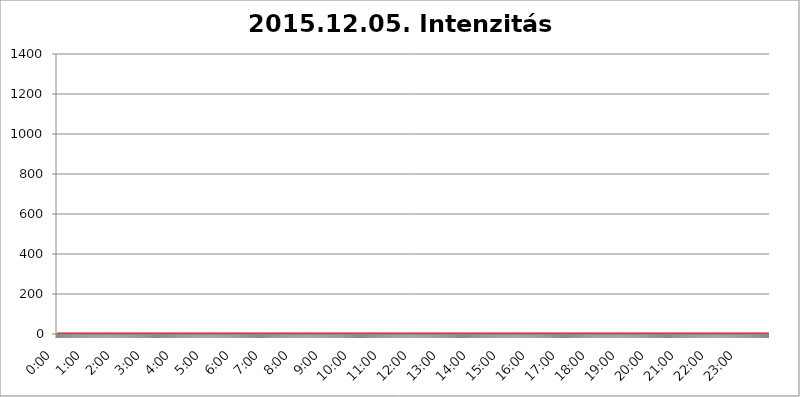
| Category | 2015.12.05. Intenzitás [W/m^2] |
|---|---|
| 0.0 | 0 |
| 0.0006944444444444445 | 0 |
| 0.001388888888888889 | 0 |
| 0.0020833333333333333 | 0 |
| 0.002777777777777778 | 0 |
| 0.003472222222222222 | 0 |
| 0.004166666666666667 | 0 |
| 0.004861111111111111 | 0 |
| 0.005555555555555556 | 0 |
| 0.0062499999999999995 | 0 |
| 0.006944444444444444 | 0 |
| 0.007638888888888889 | 0 |
| 0.008333333333333333 | 0 |
| 0.009027777777777779 | 0 |
| 0.009722222222222222 | 0 |
| 0.010416666666666666 | 0 |
| 0.011111111111111112 | 0 |
| 0.011805555555555555 | 0 |
| 0.012499999999999999 | 0 |
| 0.013194444444444444 | 0 |
| 0.013888888888888888 | 0 |
| 0.014583333333333332 | 0 |
| 0.015277777777777777 | 0 |
| 0.015972222222222224 | 0 |
| 0.016666666666666666 | 0 |
| 0.017361111111111112 | 0 |
| 0.018055555555555557 | 0 |
| 0.01875 | 0 |
| 0.019444444444444445 | 0 |
| 0.02013888888888889 | 0 |
| 0.020833333333333332 | 0 |
| 0.02152777777777778 | 0 |
| 0.022222222222222223 | 0 |
| 0.02291666666666667 | 0 |
| 0.02361111111111111 | 0 |
| 0.024305555555555556 | 0 |
| 0.024999999999999998 | 0 |
| 0.025694444444444447 | 0 |
| 0.02638888888888889 | 0 |
| 0.027083333333333334 | 0 |
| 0.027777777777777776 | 0 |
| 0.02847222222222222 | 0 |
| 0.029166666666666664 | 0 |
| 0.029861111111111113 | 0 |
| 0.030555555555555555 | 0 |
| 0.03125 | 0 |
| 0.03194444444444445 | 0 |
| 0.03263888888888889 | 0 |
| 0.03333333333333333 | 0 |
| 0.034027777777777775 | 0 |
| 0.034722222222222224 | 0 |
| 0.035416666666666666 | 0 |
| 0.036111111111111115 | 0 |
| 0.03680555555555556 | 0 |
| 0.0375 | 0 |
| 0.03819444444444444 | 0 |
| 0.03888888888888889 | 0 |
| 0.03958333333333333 | 0 |
| 0.04027777777777778 | 0 |
| 0.04097222222222222 | 0 |
| 0.041666666666666664 | 0 |
| 0.042361111111111106 | 0 |
| 0.04305555555555556 | 0 |
| 0.043750000000000004 | 0 |
| 0.044444444444444446 | 0 |
| 0.04513888888888889 | 0 |
| 0.04583333333333334 | 0 |
| 0.04652777777777778 | 0 |
| 0.04722222222222222 | 0 |
| 0.04791666666666666 | 0 |
| 0.04861111111111111 | 0 |
| 0.049305555555555554 | 0 |
| 0.049999999999999996 | 0 |
| 0.05069444444444445 | 0 |
| 0.051388888888888894 | 0 |
| 0.052083333333333336 | 0 |
| 0.05277777777777778 | 0 |
| 0.05347222222222222 | 0 |
| 0.05416666666666667 | 0 |
| 0.05486111111111111 | 0 |
| 0.05555555555555555 | 0 |
| 0.05625 | 0 |
| 0.05694444444444444 | 0 |
| 0.057638888888888885 | 0 |
| 0.05833333333333333 | 0 |
| 0.05902777777777778 | 0 |
| 0.059722222222222225 | 0 |
| 0.06041666666666667 | 0 |
| 0.061111111111111116 | 0 |
| 0.06180555555555556 | 0 |
| 0.0625 | 0 |
| 0.06319444444444444 | 0 |
| 0.06388888888888888 | 0 |
| 0.06458333333333334 | 0 |
| 0.06527777777777778 | 0 |
| 0.06597222222222222 | 0 |
| 0.06666666666666667 | 0 |
| 0.06736111111111111 | 0 |
| 0.06805555555555555 | 0 |
| 0.06874999999999999 | 0 |
| 0.06944444444444443 | 0 |
| 0.07013888888888889 | 0 |
| 0.07083333333333333 | 0 |
| 0.07152777777777779 | 0 |
| 0.07222222222222223 | 0 |
| 0.07291666666666667 | 0 |
| 0.07361111111111111 | 0 |
| 0.07430555555555556 | 0 |
| 0.075 | 0 |
| 0.07569444444444444 | 0 |
| 0.0763888888888889 | 0 |
| 0.07708333333333334 | 0 |
| 0.07777777777777778 | 0 |
| 0.07847222222222222 | 0 |
| 0.07916666666666666 | 0 |
| 0.0798611111111111 | 0 |
| 0.08055555555555556 | 0 |
| 0.08125 | 0 |
| 0.08194444444444444 | 0 |
| 0.08263888888888889 | 0 |
| 0.08333333333333333 | 0 |
| 0.08402777777777777 | 0 |
| 0.08472222222222221 | 0 |
| 0.08541666666666665 | 0 |
| 0.08611111111111112 | 0 |
| 0.08680555555555557 | 0 |
| 0.08750000000000001 | 0 |
| 0.08819444444444445 | 0 |
| 0.08888888888888889 | 0 |
| 0.08958333333333333 | 0 |
| 0.09027777777777778 | 0 |
| 0.09097222222222222 | 0 |
| 0.09166666666666667 | 0 |
| 0.09236111111111112 | 0 |
| 0.09305555555555556 | 0 |
| 0.09375 | 0 |
| 0.09444444444444444 | 0 |
| 0.09513888888888888 | 0 |
| 0.09583333333333333 | 0 |
| 0.09652777777777777 | 0 |
| 0.09722222222222222 | 0 |
| 0.09791666666666667 | 0 |
| 0.09861111111111111 | 0 |
| 0.09930555555555555 | 0 |
| 0.09999999999999999 | 0 |
| 0.10069444444444443 | 0 |
| 0.1013888888888889 | 0 |
| 0.10208333333333335 | 0 |
| 0.10277777777777779 | 0 |
| 0.10347222222222223 | 0 |
| 0.10416666666666667 | 0 |
| 0.10486111111111111 | 0 |
| 0.10555555555555556 | 0 |
| 0.10625 | 0 |
| 0.10694444444444444 | 0 |
| 0.1076388888888889 | 0 |
| 0.10833333333333334 | 0 |
| 0.10902777777777778 | 0 |
| 0.10972222222222222 | 0 |
| 0.1111111111111111 | 0 |
| 0.11180555555555556 | 0 |
| 0.11180555555555556 | 0 |
| 0.1125 | 0 |
| 0.11319444444444444 | 0 |
| 0.11388888888888889 | 0 |
| 0.11458333333333333 | 0 |
| 0.11527777777777777 | 0 |
| 0.11597222222222221 | 0 |
| 0.11666666666666665 | 0 |
| 0.1173611111111111 | 0 |
| 0.11805555555555557 | 0 |
| 0.11944444444444445 | 0 |
| 0.12013888888888889 | 0 |
| 0.12083333333333333 | 0 |
| 0.12152777777777778 | 0 |
| 0.12222222222222223 | 0 |
| 0.12291666666666667 | 0 |
| 0.12291666666666667 | 0 |
| 0.12361111111111112 | 0 |
| 0.12430555555555556 | 0 |
| 0.125 | 0 |
| 0.12569444444444444 | 0 |
| 0.12638888888888888 | 0 |
| 0.12708333333333333 | 0 |
| 0.16875 | 0 |
| 0.12847222222222224 | 0 |
| 0.12916666666666668 | 0 |
| 0.12986111111111112 | 0 |
| 0.13055555555555556 | 0 |
| 0.13125 | 0 |
| 0.13194444444444445 | 0 |
| 0.1326388888888889 | 0 |
| 0.13333333333333333 | 0 |
| 0.13402777777777777 | 0 |
| 0.13402777777777777 | 0 |
| 0.13472222222222222 | 0 |
| 0.13541666666666666 | 0 |
| 0.1361111111111111 | 0 |
| 0.13749999999999998 | 0 |
| 0.13819444444444443 | 0 |
| 0.1388888888888889 | 0 |
| 0.13958333333333334 | 0 |
| 0.14027777777777778 | 0 |
| 0.14097222222222222 | 0 |
| 0.14166666666666666 | 0 |
| 0.1423611111111111 | 0 |
| 0.14305555555555557 | 0 |
| 0.14375000000000002 | 0 |
| 0.14444444444444446 | 0 |
| 0.1451388888888889 | 0 |
| 0.1451388888888889 | 0 |
| 0.14652777777777778 | 0 |
| 0.14722222222222223 | 0 |
| 0.14791666666666667 | 0 |
| 0.1486111111111111 | 0 |
| 0.14930555555555555 | 0 |
| 0.15 | 0 |
| 0.15069444444444444 | 0 |
| 0.15138888888888888 | 0 |
| 0.15208333333333332 | 0 |
| 0.15277777777777776 | 0 |
| 0.15347222222222223 | 0 |
| 0.15416666666666667 | 0 |
| 0.15486111111111112 | 0 |
| 0.15555555555555556 | 0 |
| 0.15625 | 0 |
| 0.15694444444444444 | 0 |
| 0.15763888888888888 | 0 |
| 0.15833333333333333 | 0 |
| 0.15902777777777777 | 0 |
| 0.15972222222222224 | 0 |
| 0.16041666666666668 | 0 |
| 0.16111111111111112 | 0 |
| 0.16180555555555556 | 0 |
| 0.1625 | 0 |
| 0.16319444444444445 | 0 |
| 0.1638888888888889 | 0 |
| 0.16458333333333333 | 0 |
| 0.16527777777777777 | 0 |
| 0.16597222222222222 | 0 |
| 0.16666666666666666 | 0 |
| 0.1673611111111111 | 0 |
| 0.16805555555555554 | 0 |
| 0.16874999999999998 | 0 |
| 0.16944444444444443 | 0 |
| 0.17013888888888887 | 0 |
| 0.1708333333333333 | 0 |
| 0.17152777777777775 | 0 |
| 0.17222222222222225 | 0 |
| 0.1729166666666667 | 0 |
| 0.17361111111111113 | 0 |
| 0.17430555555555557 | 0 |
| 0.17500000000000002 | 0 |
| 0.17569444444444446 | 0 |
| 0.1763888888888889 | 0 |
| 0.17708333333333334 | 0 |
| 0.17777777777777778 | 0 |
| 0.17847222222222223 | 0 |
| 0.17916666666666667 | 0 |
| 0.1798611111111111 | 0 |
| 0.18055555555555555 | 0 |
| 0.18125 | 0 |
| 0.18194444444444444 | 0 |
| 0.1826388888888889 | 0 |
| 0.18333333333333335 | 0 |
| 0.1840277777777778 | 0 |
| 0.18472222222222223 | 0 |
| 0.18541666666666667 | 0 |
| 0.18611111111111112 | 0 |
| 0.18680555555555556 | 0 |
| 0.1875 | 0 |
| 0.18819444444444444 | 0 |
| 0.18888888888888888 | 0 |
| 0.18958333333333333 | 0 |
| 0.19027777777777777 | 0 |
| 0.1909722222222222 | 0 |
| 0.19166666666666665 | 0 |
| 0.19236111111111112 | 0 |
| 0.19305555555555554 | 0 |
| 0.19375 | 0 |
| 0.19444444444444445 | 0 |
| 0.1951388888888889 | 0 |
| 0.19583333333333333 | 0 |
| 0.19652777777777777 | 0 |
| 0.19722222222222222 | 0 |
| 0.19791666666666666 | 0 |
| 0.1986111111111111 | 0 |
| 0.19930555555555554 | 0 |
| 0.19999999999999998 | 0 |
| 0.20069444444444443 | 0 |
| 0.20138888888888887 | 0 |
| 0.2020833333333333 | 0 |
| 0.2027777777777778 | 0 |
| 0.2034722222222222 | 0 |
| 0.2041666666666667 | 0 |
| 0.20486111111111113 | 0 |
| 0.20555555555555557 | 0 |
| 0.20625000000000002 | 0 |
| 0.20694444444444446 | 0 |
| 0.2076388888888889 | 0 |
| 0.20833333333333334 | 0 |
| 0.20902777777777778 | 0 |
| 0.20972222222222223 | 0 |
| 0.21041666666666667 | 0 |
| 0.2111111111111111 | 0 |
| 0.21180555555555555 | 0 |
| 0.2125 | 0 |
| 0.21319444444444444 | 0 |
| 0.2138888888888889 | 0 |
| 0.21458333333333335 | 0 |
| 0.2152777777777778 | 0 |
| 0.21597222222222223 | 0 |
| 0.21666666666666667 | 0 |
| 0.21736111111111112 | 0 |
| 0.21805555555555556 | 0 |
| 0.21875 | 0 |
| 0.21944444444444444 | 0 |
| 0.22013888888888888 | 0 |
| 0.22083333333333333 | 0 |
| 0.22152777777777777 | 0 |
| 0.2222222222222222 | 0 |
| 0.22291666666666665 | 0 |
| 0.2236111111111111 | 0 |
| 0.22430555555555556 | 0 |
| 0.225 | 0 |
| 0.22569444444444445 | 0 |
| 0.2263888888888889 | 0 |
| 0.22708333333333333 | 0 |
| 0.22777777777777777 | 0 |
| 0.22847222222222222 | 0 |
| 0.22916666666666666 | 0 |
| 0.2298611111111111 | 0 |
| 0.23055555555555554 | 0 |
| 0.23124999999999998 | 0 |
| 0.23194444444444443 | 0 |
| 0.23263888888888887 | 0 |
| 0.2333333333333333 | 0 |
| 0.2340277777777778 | 0 |
| 0.2347222222222222 | 0 |
| 0.2354166666666667 | 0 |
| 0.23611111111111113 | 0 |
| 0.23680555555555557 | 0 |
| 0.23750000000000002 | 0 |
| 0.23819444444444446 | 0 |
| 0.2388888888888889 | 0 |
| 0.23958333333333334 | 0 |
| 0.24027777777777778 | 0 |
| 0.24097222222222223 | 0 |
| 0.24166666666666667 | 0 |
| 0.2423611111111111 | 0 |
| 0.24305555555555555 | 0 |
| 0.24375 | 0 |
| 0.24444444444444446 | 0 |
| 0.24513888888888888 | 0 |
| 0.24583333333333335 | 0 |
| 0.2465277777777778 | 0 |
| 0.24722222222222223 | 0 |
| 0.24791666666666667 | 0 |
| 0.24861111111111112 | 0 |
| 0.24930555555555556 | 0 |
| 0.25 | 0 |
| 0.25069444444444444 | 0 |
| 0.2513888888888889 | 0 |
| 0.2520833333333333 | 0 |
| 0.25277777777777777 | 0 |
| 0.2534722222222222 | 0 |
| 0.25416666666666665 | 0 |
| 0.2548611111111111 | 0 |
| 0.2555555555555556 | 0 |
| 0.25625000000000003 | 0 |
| 0.2569444444444445 | 0 |
| 0.2576388888888889 | 0 |
| 0.25833333333333336 | 0 |
| 0.2590277777777778 | 0 |
| 0.25972222222222224 | 0 |
| 0.2604166666666667 | 0 |
| 0.2611111111111111 | 0 |
| 0.26180555555555557 | 0 |
| 0.2625 | 0 |
| 0.26319444444444445 | 0 |
| 0.2638888888888889 | 0 |
| 0.26458333333333334 | 0 |
| 0.2652777777777778 | 0 |
| 0.2659722222222222 | 0 |
| 0.26666666666666666 | 0 |
| 0.2673611111111111 | 0 |
| 0.26805555555555555 | 0 |
| 0.26875 | 0 |
| 0.26944444444444443 | 0 |
| 0.2701388888888889 | 0 |
| 0.2708333333333333 | 0 |
| 0.27152777777777776 | 0 |
| 0.2722222222222222 | 0 |
| 0.27291666666666664 | 0 |
| 0.2736111111111111 | 0 |
| 0.2743055555555555 | 0 |
| 0.27499999999999997 | 0 |
| 0.27569444444444446 | 0 |
| 0.27638888888888885 | 0 |
| 0.27708333333333335 | 0 |
| 0.2777777777777778 | 0 |
| 0.27847222222222223 | 0 |
| 0.2791666666666667 | 0 |
| 0.2798611111111111 | 0 |
| 0.28055555555555556 | 0 |
| 0.28125 | 0 |
| 0.28194444444444444 | 0 |
| 0.2826388888888889 | 0 |
| 0.2833333333333333 | 0 |
| 0.28402777777777777 | 0 |
| 0.2847222222222222 | 0 |
| 0.28541666666666665 | 0 |
| 0.28611111111111115 | 0 |
| 0.28680555555555554 | 0 |
| 0.28750000000000003 | 0 |
| 0.2881944444444445 | 0 |
| 0.2888888888888889 | 0 |
| 0.28958333333333336 | 0 |
| 0.2902777777777778 | 0 |
| 0.29097222222222224 | 0 |
| 0.2916666666666667 | 0 |
| 0.2923611111111111 | 0 |
| 0.29305555555555557 | 0 |
| 0.29375 | 0 |
| 0.29444444444444445 | 0 |
| 0.2951388888888889 | 0 |
| 0.29583333333333334 | 0 |
| 0.2965277777777778 | 0 |
| 0.2972222222222222 | 0 |
| 0.29791666666666666 | 0 |
| 0.2986111111111111 | 0 |
| 0.29930555555555555 | 0 |
| 0.3 | 0 |
| 0.30069444444444443 | 0 |
| 0.3013888888888889 | 0 |
| 0.3020833333333333 | 0 |
| 0.30277777777777776 | 0 |
| 0.3034722222222222 | 0 |
| 0.30416666666666664 | 0 |
| 0.3048611111111111 | 0 |
| 0.3055555555555555 | 0 |
| 0.30624999999999997 | 0 |
| 0.3069444444444444 | 0 |
| 0.3076388888888889 | 0 |
| 0.30833333333333335 | 0 |
| 0.3090277777777778 | 0 |
| 0.30972222222222223 | 0 |
| 0.3104166666666667 | 0 |
| 0.3111111111111111 | 0 |
| 0.31180555555555556 | 0 |
| 0.3125 | 0 |
| 0.31319444444444444 | 0 |
| 0.3138888888888889 | 0 |
| 0.3145833333333333 | 0 |
| 0.31527777777777777 | 0 |
| 0.3159722222222222 | 0 |
| 0.31666666666666665 | 0 |
| 0.31736111111111115 | 0 |
| 0.31805555555555554 | 0 |
| 0.31875000000000003 | 0 |
| 0.3194444444444445 | 0 |
| 0.3201388888888889 | 0 |
| 0.32083333333333336 | 0 |
| 0.3215277777777778 | 0 |
| 0.32222222222222224 | 0 |
| 0.3229166666666667 | 0 |
| 0.3236111111111111 | 0 |
| 0.32430555555555557 | 0 |
| 0.325 | 0 |
| 0.32569444444444445 | 0 |
| 0.3263888888888889 | 0 |
| 0.32708333333333334 | 0 |
| 0.3277777777777778 | 0 |
| 0.3284722222222222 | 0 |
| 0.32916666666666666 | 0 |
| 0.3298611111111111 | 0 |
| 0.33055555555555555 | 0 |
| 0.33125 | 0 |
| 0.33194444444444443 | 0 |
| 0.3326388888888889 | 0 |
| 0.3333333333333333 | 0 |
| 0.3340277777777778 | 0 |
| 0.3347222222222222 | 0 |
| 0.3354166666666667 | 0 |
| 0.3361111111111111 | 0 |
| 0.3368055555555556 | 0 |
| 0.33749999999999997 | 0 |
| 0.33819444444444446 | 0 |
| 0.33888888888888885 | 0 |
| 0.33958333333333335 | 0 |
| 0.34027777777777773 | 0 |
| 0.34097222222222223 | 0 |
| 0.3416666666666666 | 0 |
| 0.3423611111111111 | 0 |
| 0.3430555555555555 | 0 |
| 0.34375 | 0 |
| 0.3444444444444445 | 0 |
| 0.3451388888888889 | 0 |
| 0.3458333333333334 | 0 |
| 0.34652777777777777 | 0 |
| 0.34722222222222227 | 0 |
| 0.34791666666666665 | 0 |
| 0.34861111111111115 | 0 |
| 0.34930555555555554 | 0 |
| 0.35000000000000003 | 0 |
| 0.3506944444444444 | 0 |
| 0.3513888888888889 | 0 |
| 0.3520833333333333 | 0 |
| 0.3527777777777778 | 0 |
| 0.3534722222222222 | 0 |
| 0.3541666666666667 | 0 |
| 0.3548611111111111 | 0 |
| 0.35555555555555557 | 0 |
| 0.35625 | 0 |
| 0.35694444444444445 | 0 |
| 0.3576388888888889 | 0 |
| 0.35833333333333334 | 0 |
| 0.3590277777777778 | 0 |
| 0.3597222222222222 | 0 |
| 0.36041666666666666 | 0 |
| 0.3611111111111111 | 0 |
| 0.36180555555555555 | 0 |
| 0.3625 | 0 |
| 0.36319444444444443 | 0 |
| 0.3638888888888889 | 0 |
| 0.3645833333333333 | 0 |
| 0.3652777777777778 | 0 |
| 0.3659722222222222 | 0 |
| 0.3666666666666667 | 0 |
| 0.3673611111111111 | 0 |
| 0.3680555555555556 | 0 |
| 0.36874999999999997 | 0 |
| 0.36944444444444446 | 0 |
| 0.37013888888888885 | 0 |
| 0.37083333333333335 | 0 |
| 0.37152777777777773 | 0 |
| 0.37222222222222223 | 0 |
| 0.3729166666666666 | 0 |
| 0.3736111111111111 | 0 |
| 0.3743055555555555 | 0 |
| 0.375 | 0 |
| 0.3756944444444445 | 0 |
| 0.3763888888888889 | 0 |
| 0.3770833333333334 | 0 |
| 0.37777777777777777 | 0 |
| 0.37847222222222227 | 0 |
| 0.37916666666666665 | 0 |
| 0.37986111111111115 | 0 |
| 0.38055555555555554 | 0 |
| 0.38125000000000003 | 0 |
| 0.3819444444444444 | 0 |
| 0.3826388888888889 | 0 |
| 0.3833333333333333 | 0 |
| 0.3840277777777778 | 0 |
| 0.3847222222222222 | 0 |
| 0.3854166666666667 | 0 |
| 0.3861111111111111 | 0 |
| 0.38680555555555557 | 0 |
| 0.3875 | 0 |
| 0.38819444444444445 | 0 |
| 0.3888888888888889 | 0 |
| 0.38958333333333334 | 0 |
| 0.3902777777777778 | 0 |
| 0.3909722222222222 | 0 |
| 0.39166666666666666 | 0 |
| 0.3923611111111111 | 0 |
| 0.39305555555555555 | 0 |
| 0.39375 | 0 |
| 0.39444444444444443 | 0 |
| 0.3951388888888889 | 0 |
| 0.3958333333333333 | 0 |
| 0.3965277777777778 | 0 |
| 0.3972222222222222 | 0 |
| 0.3979166666666667 | 0 |
| 0.3986111111111111 | 0 |
| 0.3993055555555556 | 0 |
| 0.39999999999999997 | 0 |
| 0.40069444444444446 | 0 |
| 0.40138888888888885 | 0 |
| 0.40208333333333335 | 0 |
| 0.40277777777777773 | 0 |
| 0.40347222222222223 | 0 |
| 0.4041666666666666 | 0 |
| 0.4048611111111111 | 0 |
| 0.4055555555555555 | 0 |
| 0.40625 | 0 |
| 0.4069444444444445 | 0 |
| 0.4076388888888889 | 0 |
| 0.4083333333333334 | 0 |
| 0.40902777777777777 | 0 |
| 0.40972222222222227 | 0 |
| 0.41041666666666665 | 0 |
| 0.41111111111111115 | 0 |
| 0.41180555555555554 | 0 |
| 0.41250000000000003 | 0 |
| 0.4131944444444444 | 0 |
| 0.4138888888888889 | 0 |
| 0.4145833333333333 | 0 |
| 0.4152777777777778 | 0 |
| 0.4159722222222222 | 0 |
| 0.4166666666666667 | 0 |
| 0.4173611111111111 | 0 |
| 0.41805555555555557 | 0 |
| 0.41875 | 0 |
| 0.41944444444444445 | 0 |
| 0.4201388888888889 | 0 |
| 0.42083333333333334 | 0 |
| 0.4215277777777778 | 0 |
| 0.4222222222222222 | 0 |
| 0.42291666666666666 | 0 |
| 0.4236111111111111 | 0 |
| 0.42430555555555555 | 0 |
| 0.425 | 0 |
| 0.42569444444444443 | 0 |
| 0.4263888888888889 | 0 |
| 0.4270833333333333 | 0 |
| 0.4277777777777778 | 0 |
| 0.4284722222222222 | 0 |
| 0.4291666666666667 | 0 |
| 0.4298611111111111 | 0 |
| 0.4305555555555556 | 0 |
| 0.43124999999999997 | 0 |
| 0.43194444444444446 | 0 |
| 0.43263888888888885 | 0 |
| 0.43333333333333335 | 0 |
| 0.43402777777777773 | 0 |
| 0.43472222222222223 | 0 |
| 0.4354166666666666 | 0 |
| 0.4361111111111111 | 0 |
| 0.4368055555555555 | 0 |
| 0.4375 | 0 |
| 0.4381944444444445 | 0 |
| 0.4388888888888889 | 0 |
| 0.4395833333333334 | 0 |
| 0.44027777777777777 | 0 |
| 0.44097222222222227 | 0 |
| 0.44166666666666665 | 0 |
| 0.44236111111111115 | 0 |
| 0.44305555555555554 | 0 |
| 0.44375000000000003 | 0 |
| 0.4444444444444444 | 0 |
| 0.4451388888888889 | 0 |
| 0.4458333333333333 | 0 |
| 0.4465277777777778 | 0 |
| 0.4472222222222222 | 0 |
| 0.4479166666666667 | 0 |
| 0.4486111111111111 | 0 |
| 0.44930555555555557 | 0 |
| 0.45 | 0 |
| 0.45069444444444445 | 0 |
| 0.4513888888888889 | 0 |
| 0.45208333333333334 | 0 |
| 0.4527777777777778 | 0 |
| 0.4534722222222222 | 0 |
| 0.45416666666666666 | 0 |
| 0.4548611111111111 | 0 |
| 0.45555555555555555 | 0 |
| 0.45625 | 0 |
| 0.45694444444444443 | 0 |
| 0.4576388888888889 | 0 |
| 0.4583333333333333 | 0 |
| 0.4590277777777778 | 0 |
| 0.4597222222222222 | 0 |
| 0.4604166666666667 | 0 |
| 0.4611111111111111 | 0 |
| 0.4618055555555556 | 0 |
| 0.46249999999999997 | 0 |
| 0.46319444444444446 | 0 |
| 0.46388888888888885 | 0 |
| 0.46458333333333335 | 0 |
| 0.46527777777777773 | 0 |
| 0.46597222222222223 | 0 |
| 0.4666666666666666 | 0 |
| 0.4673611111111111 | 0 |
| 0.4680555555555555 | 0 |
| 0.46875 | 0 |
| 0.4694444444444445 | 0 |
| 0.4701388888888889 | 0 |
| 0.4708333333333334 | 0 |
| 0.47152777777777777 | 0 |
| 0.47222222222222227 | 0 |
| 0.47291666666666665 | 0 |
| 0.47361111111111115 | 0 |
| 0.47430555555555554 | 0 |
| 0.47500000000000003 | 0 |
| 0.4756944444444444 | 0 |
| 0.4763888888888889 | 0 |
| 0.4770833333333333 | 0 |
| 0.4777777777777778 | 0 |
| 0.4784722222222222 | 0 |
| 0.4791666666666667 | 0 |
| 0.4798611111111111 | 0 |
| 0.48055555555555557 | 0 |
| 0.48125 | 0 |
| 0.48194444444444445 | 0 |
| 0.4826388888888889 | 0 |
| 0.48333333333333334 | 0 |
| 0.4840277777777778 | 0 |
| 0.4847222222222222 | 0 |
| 0.48541666666666666 | 0 |
| 0.4861111111111111 | 0 |
| 0.48680555555555555 | 0 |
| 0.4875 | 0 |
| 0.48819444444444443 | 0 |
| 0.4888888888888889 | 0 |
| 0.4895833333333333 | 0 |
| 0.4902777777777778 | 0 |
| 0.4909722222222222 | 0 |
| 0.4916666666666667 | 0 |
| 0.4923611111111111 | 0 |
| 0.4930555555555556 | 0 |
| 0.49374999999999997 | 0 |
| 0.49444444444444446 | 0 |
| 0.49513888888888885 | 0 |
| 0.49583333333333335 | 0 |
| 0.49652777777777773 | 0 |
| 0.49722222222222223 | 0 |
| 0.4979166666666666 | 0 |
| 0.4986111111111111 | 0 |
| 0.4993055555555555 | 0 |
| 0.5 | 0 |
| 0.5006944444444444 | 0 |
| 0.5013888888888889 | 0 |
| 0.5020833333333333 | 0 |
| 0.5027777777777778 | 0 |
| 0.5034722222222222 | 0 |
| 0.5041666666666667 | 0 |
| 0.5048611111111111 | 0 |
| 0.5055555555555555 | 0 |
| 0.50625 | 0 |
| 0.5069444444444444 | 0 |
| 0.5076388888888889 | 0 |
| 0.5083333333333333 | 0 |
| 0.5090277777777777 | 0 |
| 0.5097222222222222 | 0 |
| 0.5104166666666666 | 0 |
| 0.5111111111111112 | 0 |
| 0.5118055555555555 | 0 |
| 0.5125000000000001 | 0 |
| 0.5131944444444444 | 0 |
| 0.513888888888889 | 0 |
| 0.5145833333333333 | 0 |
| 0.5152777777777778 | 0 |
| 0.5159722222222222 | 0 |
| 0.5166666666666667 | 0 |
| 0.517361111111111 | 0 |
| 0.5180555555555556 | 0 |
| 0.5187499999999999 | 0 |
| 0.5194444444444445 | 0 |
| 0.5201388888888888 | 0 |
| 0.5208333333333334 | 0 |
| 0.5215277777777778 | 0 |
| 0.5222222222222223 | 0 |
| 0.5229166666666667 | 0 |
| 0.5236111111111111 | 0 |
| 0.5243055555555556 | 0 |
| 0.525 | 0 |
| 0.5256944444444445 | 0 |
| 0.5263888888888889 | 0 |
| 0.5270833333333333 | 0 |
| 0.5277777777777778 | 0 |
| 0.5284722222222222 | 0 |
| 0.5291666666666667 | 0 |
| 0.5298611111111111 | 0 |
| 0.5305555555555556 | 0 |
| 0.53125 | 0 |
| 0.5319444444444444 | 0 |
| 0.5326388888888889 | 0 |
| 0.5333333333333333 | 0 |
| 0.5340277777777778 | 0 |
| 0.5347222222222222 | 0 |
| 0.5354166666666667 | 0 |
| 0.5361111111111111 | 0 |
| 0.5368055555555555 | 0 |
| 0.5375 | 0 |
| 0.5381944444444444 | 0 |
| 0.5388888888888889 | 0 |
| 0.5395833333333333 | 0 |
| 0.5402777777777777 | 0 |
| 0.5409722222222222 | 0 |
| 0.5416666666666666 | 0 |
| 0.5423611111111112 | 0 |
| 0.5430555555555555 | 0 |
| 0.5437500000000001 | 0 |
| 0.5444444444444444 | 0 |
| 0.545138888888889 | 0 |
| 0.5458333333333333 | 0 |
| 0.5465277777777778 | 0 |
| 0.5472222222222222 | 0 |
| 0.5479166666666667 | 0 |
| 0.548611111111111 | 0 |
| 0.5493055555555556 | 0 |
| 0.5499999999999999 | 0 |
| 0.5506944444444445 | 0 |
| 0.5513888888888888 | 0 |
| 0.5520833333333334 | 0 |
| 0.5527777777777778 | 0 |
| 0.5534722222222223 | 0 |
| 0.5541666666666667 | 0 |
| 0.5548611111111111 | 0 |
| 0.5555555555555556 | 0 |
| 0.55625 | 0 |
| 0.5569444444444445 | 0 |
| 0.5576388888888889 | 0 |
| 0.5583333333333333 | 0 |
| 0.5590277777777778 | 0 |
| 0.5597222222222222 | 0 |
| 0.5604166666666667 | 0 |
| 0.5611111111111111 | 0 |
| 0.5618055555555556 | 0 |
| 0.5625 | 0 |
| 0.5631944444444444 | 0 |
| 0.5638888888888889 | 0 |
| 0.5645833333333333 | 0 |
| 0.5652777777777778 | 0 |
| 0.5659722222222222 | 0 |
| 0.5666666666666667 | 0 |
| 0.5673611111111111 | 0 |
| 0.5680555555555555 | 0 |
| 0.56875 | 0 |
| 0.5694444444444444 | 0 |
| 0.5701388888888889 | 0 |
| 0.5708333333333333 | 0 |
| 0.5715277777777777 | 0 |
| 0.5722222222222222 | 0 |
| 0.5729166666666666 | 0 |
| 0.5736111111111112 | 0 |
| 0.5743055555555555 | 0 |
| 0.5750000000000001 | 0 |
| 0.5756944444444444 | 0 |
| 0.576388888888889 | 0 |
| 0.5770833333333333 | 0 |
| 0.5777777777777778 | 0 |
| 0.5784722222222222 | 0 |
| 0.5791666666666667 | 0 |
| 0.579861111111111 | 0 |
| 0.5805555555555556 | 0 |
| 0.5812499999999999 | 0 |
| 0.5819444444444445 | 0 |
| 0.5826388888888888 | 0 |
| 0.5833333333333334 | 0 |
| 0.5840277777777778 | 0 |
| 0.5847222222222223 | 0 |
| 0.5854166666666667 | 0 |
| 0.5861111111111111 | 0 |
| 0.5868055555555556 | 0 |
| 0.5875 | 0 |
| 0.5881944444444445 | 0 |
| 0.5888888888888889 | 0 |
| 0.5895833333333333 | 0 |
| 0.5902777777777778 | 0 |
| 0.5909722222222222 | 0 |
| 0.5916666666666667 | 0 |
| 0.5923611111111111 | 0 |
| 0.5930555555555556 | 0 |
| 0.59375 | 0 |
| 0.5944444444444444 | 0 |
| 0.5951388888888889 | 0 |
| 0.5958333333333333 | 0 |
| 0.5965277777777778 | 0 |
| 0.5972222222222222 | 0 |
| 0.5979166666666667 | 0 |
| 0.5986111111111111 | 0 |
| 0.5993055555555555 | 0 |
| 0.6 | 0 |
| 0.6006944444444444 | 0 |
| 0.6013888888888889 | 0 |
| 0.6020833333333333 | 0 |
| 0.6027777777777777 | 0 |
| 0.6034722222222222 | 0 |
| 0.6041666666666666 | 0 |
| 0.6048611111111112 | 0 |
| 0.6055555555555555 | 0 |
| 0.6062500000000001 | 0 |
| 0.6069444444444444 | 0 |
| 0.607638888888889 | 0 |
| 0.6083333333333333 | 0 |
| 0.6090277777777778 | 0 |
| 0.6097222222222222 | 0 |
| 0.6104166666666667 | 0 |
| 0.611111111111111 | 0 |
| 0.6118055555555556 | 0 |
| 0.6124999999999999 | 0 |
| 0.6131944444444445 | 0 |
| 0.6138888888888888 | 0 |
| 0.6145833333333334 | 0 |
| 0.6152777777777778 | 0 |
| 0.6159722222222223 | 0 |
| 0.6166666666666667 | 0 |
| 0.6173611111111111 | 0 |
| 0.6180555555555556 | 0 |
| 0.61875 | 0 |
| 0.6194444444444445 | 0 |
| 0.6201388888888889 | 0 |
| 0.6208333333333333 | 0 |
| 0.6215277777777778 | 0 |
| 0.6222222222222222 | 0 |
| 0.6229166666666667 | 0 |
| 0.6236111111111111 | 0 |
| 0.6243055555555556 | 0 |
| 0.625 | 0 |
| 0.6256944444444444 | 0 |
| 0.6263888888888889 | 0 |
| 0.6270833333333333 | 0 |
| 0.6277777777777778 | 0 |
| 0.6284722222222222 | 0 |
| 0.6291666666666667 | 0 |
| 0.6298611111111111 | 0 |
| 0.6305555555555555 | 0 |
| 0.63125 | 0 |
| 0.6319444444444444 | 0 |
| 0.6326388888888889 | 0 |
| 0.6333333333333333 | 0 |
| 0.6340277777777777 | 0 |
| 0.6347222222222222 | 0 |
| 0.6354166666666666 | 0 |
| 0.6361111111111112 | 0 |
| 0.6368055555555555 | 0 |
| 0.6375000000000001 | 0 |
| 0.6381944444444444 | 0 |
| 0.638888888888889 | 0 |
| 0.6395833333333333 | 0 |
| 0.6402777777777778 | 0 |
| 0.6409722222222222 | 0 |
| 0.6416666666666667 | 0 |
| 0.642361111111111 | 0 |
| 0.6430555555555556 | 0 |
| 0.6437499999999999 | 0 |
| 0.6444444444444445 | 0 |
| 0.6451388888888888 | 0 |
| 0.6458333333333334 | 0 |
| 0.6465277777777778 | 0 |
| 0.6472222222222223 | 0 |
| 0.6479166666666667 | 0 |
| 0.6486111111111111 | 0 |
| 0.6493055555555556 | 0 |
| 0.65 | 0 |
| 0.6506944444444445 | 0 |
| 0.6513888888888889 | 0 |
| 0.6520833333333333 | 0 |
| 0.6527777777777778 | 0 |
| 0.6534722222222222 | 0 |
| 0.6541666666666667 | 0 |
| 0.6548611111111111 | 0 |
| 0.6555555555555556 | 0 |
| 0.65625 | 0 |
| 0.6569444444444444 | 0 |
| 0.6576388888888889 | 0 |
| 0.6583333333333333 | 0 |
| 0.6590277777777778 | 0 |
| 0.6597222222222222 | 0 |
| 0.6604166666666667 | 0 |
| 0.6611111111111111 | 0 |
| 0.6618055555555555 | 0 |
| 0.6625 | 0 |
| 0.6631944444444444 | 0 |
| 0.6638888888888889 | 0 |
| 0.6645833333333333 | 0 |
| 0.6652777777777777 | 0 |
| 0.6659722222222222 | 0 |
| 0.6666666666666666 | 0 |
| 0.6673611111111111 | 0 |
| 0.6680555555555556 | 0 |
| 0.6687500000000001 | 0 |
| 0.6694444444444444 | 0 |
| 0.6701388888888888 | 0 |
| 0.6708333333333334 | 0 |
| 0.6715277777777778 | 0 |
| 0.6722222222222222 | 0 |
| 0.6729166666666666 | 0 |
| 0.6736111111111112 | 0 |
| 0.6743055555555556 | 0 |
| 0.6749999999999999 | 0 |
| 0.6756944444444444 | 0 |
| 0.6763888888888889 | 0 |
| 0.6770833333333334 | 0 |
| 0.6777777777777777 | 0 |
| 0.6784722222222223 | 0 |
| 0.6791666666666667 | 0 |
| 0.6798611111111111 | 0 |
| 0.6805555555555555 | 0 |
| 0.68125 | 0 |
| 0.6819444444444445 | 0 |
| 0.6826388888888889 | 0 |
| 0.6833333333333332 | 0 |
| 0.6840277777777778 | 0 |
| 0.6847222222222222 | 0 |
| 0.6854166666666667 | 0 |
| 0.686111111111111 | 0 |
| 0.6868055555555556 | 0 |
| 0.6875 | 0 |
| 0.6881944444444444 | 0 |
| 0.688888888888889 | 0 |
| 0.6895833333333333 | 0 |
| 0.6902777777777778 | 0 |
| 0.6909722222222222 | 0 |
| 0.6916666666666668 | 0 |
| 0.6923611111111111 | 0 |
| 0.6930555555555555 | 0 |
| 0.69375 | 0 |
| 0.6944444444444445 | 0 |
| 0.6951388888888889 | 0 |
| 0.6958333333333333 | 0 |
| 0.6965277777777777 | 0 |
| 0.6972222222222223 | 0 |
| 0.6979166666666666 | 0 |
| 0.6986111111111111 | 0 |
| 0.6993055555555556 | 0 |
| 0.7000000000000001 | 0 |
| 0.7006944444444444 | 0 |
| 0.7013888888888888 | 0 |
| 0.7020833333333334 | 0 |
| 0.7027777777777778 | 0 |
| 0.7034722222222222 | 0 |
| 0.7041666666666666 | 0 |
| 0.7048611111111112 | 0 |
| 0.7055555555555556 | 0 |
| 0.7062499999999999 | 0 |
| 0.7069444444444444 | 0 |
| 0.7076388888888889 | 0 |
| 0.7083333333333334 | 0 |
| 0.7090277777777777 | 0 |
| 0.7097222222222223 | 0 |
| 0.7104166666666667 | 0 |
| 0.7111111111111111 | 0 |
| 0.7118055555555555 | 0 |
| 0.7125 | 0 |
| 0.7131944444444445 | 0 |
| 0.7138888888888889 | 0 |
| 0.7145833333333332 | 0 |
| 0.7152777777777778 | 0 |
| 0.7159722222222222 | 0 |
| 0.7166666666666667 | 0 |
| 0.717361111111111 | 0 |
| 0.7180555555555556 | 0 |
| 0.71875 | 0 |
| 0.7194444444444444 | 0 |
| 0.720138888888889 | 0 |
| 0.7208333333333333 | 0 |
| 0.7215277777777778 | 0 |
| 0.7222222222222222 | 0 |
| 0.7229166666666668 | 0 |
| 0.7236111111111111 | 0 |
| 0.7243055555555555 | 0 |
| 0.725 | 0 |
| 0.7256944444444445 | 0 |
| 0.7263888888888889 | 0 |
| 0.7270833333333333 | 0 |
| 0.7277777777777777 | 0 |
| 0.7284722222222223 | 0 |
| 0.7291666666666666 | 0 |
| 0.7298611111111111 | 0 |
| 0.7305555555555556 | 0 |
| 0.7312500000000001 | 0 |
| 0.7319444444444444 | 0 |
| 0.7326388888888888 | 0 |
| 0.7333333333333334 | 0 |
| 0.7340277777777778 | 0 |
| 0.7347222222222222 | 0 |
| 0.7354166666666666 | 0 |
| 0.7361111111111112 | 0 |
| 0.7368055555555556 | 0 |
| 0.7374999999999999 | 0 |
| 0.7381944444444444 | 0 |
| 0.7388888888888889 | 0 |
| 0.7395833333333334 | 0 |
| 0.7402777777777777 | 0 |
| 0.7409722222222223 | 0 |
| 0.7416666666666667 | 0 |
| 0.7423611111111111 | 0 |
| 0.7430555555555555 | 0 |
| 0.74375 | 0 |
| 0.7444444444444445 | 0 |
| 0.7451388888888889 | 0 |
| 0.7458333333333332 | 0 |
| 0.7465277777777778 | 0 |
| 0.7472222222222222 | 0 |
| 0.7479166666666667 | 0 |
| 0.748611111111111 | 0 |
| 0.7493055555555556 | 0 |
| 0.75 | 0 |
| 0.7506944444444444 | 0 |
| 0.751388888888889 | 0 |
| 0.7520833333333333 | 0 |
| 0.7527777777777778 | 0 |
| 0.7534722222222222 | 0 |
| 0.7541666666666668 | 0 |
| 0.7548611111111111 | 0 |
| 0.7555555555555555 | 0 |
| 0.75625 | 0 |
| 0.7569444444444445 | 0 |
| 0.7576388888888889 | 0 |
| 0.7583333333333333 | 0 |
| 0.7590277777777777 | 0 |
| 0.7597222222222223 | 0 |
| 0.7604166666666666 | 0 |
| 0.7611111111111111 | 0 |
| 0.7618055555555556 | 0 |
| 0.7625000000000001 | 0 |
| 0.7631944444444444 | 0 |
| 0.7638888888888888 | 0 |
| 0.7645833333333334 | 0 |
| 0.7652777777777778 | 0 |
| 0.7659722222222222 | 0 |
| 0.7666666666666666 | 0 |
| 0.7673611111111112 | 0 |
| 0.7680555555555556 | 0 |
| 0.7687499999999999 | 0 |
| 0.7694444444444444 | 0 |
| 0.7701388888888889 | 0 |
| 0.7708333333333334 | 0 |
| 0.7715277777777777 | 0 |
| 0.7722222222222223 | 0 |
| 0.7729166666666667 | 0 |
| 0.7736111111111111 | 0 |
| 0.7743055555555555 | 0 |
| 0.775 | 0 |
| 0.7756944444444445 | 0 |
| 0.7763888888888889 | 0 |
| 0.7770833333333332 | 0 |
| 0.7777777777777778 | 0 |
| 0.7784722222222222 | 0 |
| 0.7791666666666667 | 0 |
| 0.779861111111111 | 0 |
| 0.7805555555555556 | 0 |
| 0.78125 | 0 |
| 0.7819444444444444 | 0 |
| 0.782638888888889 | 0 |
| 0.7833333333333333 | 0 |
| 0.7840277777777778 | 0 |
| 0.7847222222222222 | 0 |
| 0.7854166666666668 | 0 |
| 0.7861111111111111 | 0 |
| 0.7868055555555555 | 0 |
| 0.7875 | 0 |
| 0.7881944444444445 | 0 |
| 0.7888888888888889 | 0 |
| 0.7895833333333333 | 0 |
| 0.7902777777777777 | 0 |
| 0.7909722222222223 | 0 |
| 0.7916666666666666 | 0 |
| 0.7923611111111111 | 0 |
| 0.7930555555555556 | 0 |
| 0.7937500000000001 | 0 |
| 0.7944444444444444 | 0 |
| 0.7951388888888888 | 0 |
| 0.7958333333333334 | 0 |
| 0.7965277777777778 | 0 |
| 0.7972222222222222 | 0 |
| 0.7979166666666666 | 0 |
| 0.7986111111111112 | 0 |
| 0.7993055555555556 | 0 |
| 0.7999999999999999 | 0 |
| 0.8006944444444444 | 0 |
| 0.8013888888888889 | 0 |
| 0.8020833333333334 | 0 |
| 0.8027777777777777 | 0 |
| 0.8034722222222223 | 0 |
| 0.8041666666666667 | 0 |
| 0.8048611111111111 | 0 |
| 0.8055555555555555 | 0 |
| 0.80625 | 0 |
| 0.8069444444444445 | 0 |
| 0.8076388888888889 | 0 |
| 0.8083333333333332 | 0 |
| 0.8090277777777778 | 0 |
| 0.8097222222222222 | 0 |
| 0.8104166666666667 | 0 |
| 0.811111111111111 | 0 |
| 0.8118055555555556 | 0 |
| 0.8125 | 0 |
| 0.8131944444444444 | 0 |
| 0.813888888888889 | 0 |
| 0.8145833333333333 | 0 |
| 0.8152777777777778 | 0 |
| 0.8159722222222222 | 0 |
| 0.8166666666666668 | 0 |
| 0.8173611111111111 | 0 |
| 0.8180555555555555 | 0 |
| 0.81875 | 0 |
| 0.8194444444444445 | 0 |
| 0.8201388888888889 | 0 |
| 0.8208333333333333 | 0 |
| 0.8215277777777777 | 0 |
| 0.8222222222222223 | 0 |
| 0.8229166666666666 | 0 |
| 0.8236111111111111 | 0 |
| 0.8243055555555556 | 0 |
| 0.8250000000000001 | 0 |
| 0.8256944444444444 | 0 |
| 0.8263888888888888 | 0 |
| 0.8270833333333334 | 0 |
| 0.8277777777777778 | 0 |
| 0.8284722222222222 | 0 |
| 0.8291666666666666 | 0 |
| 0.8298611111111112 | 0 |
| 0.8305555555555556 | 0 |
| 0.8312499999999999 | 0 |
| 0.8319444444444444 | 0 |
| 0.8326388888888889 | 0 |
| 0.8333333333333334 | 0 |
| 0.8340277777777777 | 0 |
| 0.8347222222222223 | 0 |
| 0.8354166666666667 | 0 |
| 0.8361111111111111 | 0 |
| 0.8368055555555555 | 0 |
| 0.8375 | 0 |
| 0.8381944444444445 | 0 |
| 0.8388888888888889 | 0 |
| 0.8395833333333332 | 0 |
| 0.8402777777777778 | 0 |
| 0.8409722222222222 | 0 |
| 0.8416666666666667 | 0 |
| 0.842361111111111 | 0 |
| 0.8430555555555556 | 0 |
| 0.84375 | 0 |
| 0.8444444444444444 | 0 |
| 0.845138888888889 | 0 |
| 0.8458333333333333 | 0 |
| 0.8465277777777778 | 0 |
| 0.8472222222222222 | 0 |
| 0.8479166666666668 | 0 |
| 0.8486111111111111 | 0 |
| 0.8493055555555555 | 0 |
| 0.85 | 0 |
| 0.8506944444444445 | 0 |
| 0.8513888888888889 | 0 |
| 0.8520833333333333 | 0 |
| 0.8527777777777777 | 0 |
| 0.8534722222222223 | 0 |
| 0.8541666666666666 | 0 |
| 0.8548611111111111 | 0 |
| 0.8555555555555556 | 0 |
| 0.8562500000000001 | 0 |
| 0.8569444444444444 | 0 |
| 0.8576388888888888 | 0 |
| 0.8583333333333334 | 0 |
| 0.8590277777777778 | 0 |
| 0.8597222222222222 | 0 |
| 0.8604166666666666 | 0 |
| 0.8611111111111112 | 0 |
| 0.8618055555555556 | 0 |
| 0.8624999999999999 | 0 |
| 0.8631944444444444 | 0 |
| 0.8638888888888889 | 0 |
| 0.8645833333333334 | 0 |
| 0.8652777777777777 | 0 |
| 0.8659722222222223 | 0 |
| 0.8666666666666667 | 0 |
| 0.8673611111111111 | 0 |
| 0.8680555555555555 | 0 |
| 0.86875 | 0 |
| 0.8694444444444445 | 0 |
| 0.8701388888888889 | 0 |
| 0.8708333333333332 | 0 |
| 0.8715277777777778 | 0 |
| 0.8722222222222222 | 0 |
| 0.8729166666666667 | 0 |
| 0.873611111111111 | 0 |
| 0.8743055555555556 | 0 |
| 0.875 | 0 |
| 0.8756944444444444 | 0 |
| 0.876388888888889 | 0 |
| 0.8770833333333333 | 0 |
| 0.8777777777777778 | 0 |
| 0.8784722222222222 | 0 |
| 0.8791666666666668 | 0 |
| 0.8798611111111111 | 0 |
| 0.8805555555555555 | 0 |
| 0.88125 | 0 |
| 0.8819444444444445 | 0 |
| 0.8826388888888889 | 0 |
| 0.8833333333333333 | 0 |
| 0.8840277777777777 | 0 |
| 0.8847222222222223 | 0 |
| 0.8854166666666666 | 0 |
| 0.8861111111111111 | 0 |
| 0.8868055555555556 | 0 |
| 0.8875000000000001 | 0 |
| 0.8881944444444444 | 0 |
| 0.8888888888888888 | 0 |
| 0.8895833333333334 | 0 |
| 0.8902777777777778 | 0 |
| 0.8909722222222222 | 0 |
| 0.8916666666666666 | 0 |
| 0.8923611111111112 | 0 |
| 0.8930555555555556 | 0 |
| 0.8937499999999999 | 0 |
| 0.8944444444444444 | 0 |
| 0.8951388888888889 | 0 |
| 0.8958333333333334 | 0 |
| 0.8965277777777777 | 0 |
| 0.8972222222222223 | 0 |
| 0.8979166666666667 | 0 |
| 0.8986111111111111 | 0 |
| 0.8993055555555555 | 0 |
| 0.9 | 0 |
| 0.9006944444444445 | 0 |
| 0.9013888888888889 | 0 |
| 0.9020833333333332 | 0 |
| 0.9027777777777778 | 0 |
| 0.9034722222222222 | 0 |
| 0.9041666666666667 | 0 |
| 0.904861111111111 | 0 |
| 0.9055555555555556 | 0 |
| 0.90625 | 0 |
| 0.9069444444444444 | 0 |
| 0.907638888888889 | 0 |
| 0.9083333333333333 | 0 |
| 0.9090277777777778 | 0 |
| 0.9097222222222222 | 0 |
| 0.9104166666666668 | 0 |
| 0.9111111111111111 | 0 |
| 0.9118055555555555 | 0 |
| 0.9125 | 0 |
| 0.9131944444444445 | 0 |
| 0.9138888888888889 | 0 |
| 0.9145833333333333 | 0 |
| 0.9152777777777777 | 0 |
| 0.9159722222222223 | 0 |
| 0.9166666666666666 | 0 |
| 0.9173611111111111 | 0 |
| 0.9180555555555556 | 0 |
| 0.9187500000000001 | 0 |
| 0.9194444444444444 | 0 |
| 0.9201388888888888 | 0 |
| 0.9208333333333334 | 0 |
| 0.9215277777777778 | 0 |
| 0.9222222222222222 | 0 |
| 0.9229166666666666 | 0 |
| 0.9236111111111112 | 0 |
| 0.9243055555555556 | 0 |
| 0.9249999999999999 | 0 |
| 0.9256944444444444 | 0 |
| 0.9263888888888889 | 0 |
| 0.9270833333333334 | 0 |
| 0.9277777777777777 | 0 |
| 0.9284722222222223 | 0 |
| 0.9291666666666667 | 0 |
| 0.9298611111111111 | 0 |
| 0.9305555555555555 | 0 |
| 0.93125 | 0 |
| 0.9319444444444445 | 0 |
| 0.9326388888888889 | 0 |
| 0.9333333333333332 | 0 |
| 0.9340277777777778 | 0 |
| 0.9347222222222222 | 0 |
| 0.9354166666666667 | 0 |
| 0.936111111111111 | 0 |
| 0.9368055555555556 | 0 |
| 0.9375 | 0 |
| 0.9381944444444444 | 0 |
| 0.938888888888889 | 0 |
| 0.9395833333333333 | 0 |
| 0.9402777777777778 | 0 |
| 0.9409722222222222 | 0 |
| 0.9416666666666668 | 0 |
| 0.9423611111111111 | 0 |
| 0.9430555555555555 | 0 |
| 0.94375 | 0 |
| 0.9444444444444445 | 0 |
| 0.9451388888888889 | 0 |
| 0.9458333333333333 | 0 |
| 0.9465277777777777 | 0 |
| 0.9472222222222223 | 0 |
| 0.9479166666666666 | 0 |
| 0.9486111111111111 | 0 |
| 0.9493055555555556 | 0 |
| 0.9500000000000001 | 0 |
| 0.9506944444444444 | 0 |
| 0.9513888888888888 | 0 |
| 0.9520833333333334 | 0 |
| 0.9527777777777778 | 0 |
| 0.9534722222222222 | 0 |
| 0.9541666666666666 | 0 |
| 0.9548611111111112 | 0 |
| 0.9555555555555556 | 0 |
| 0.9562499999999999 | 0 |
| 0.9569444444444444 | 0 |
| 0.9576388888888889 | 0 |
| 0.9583333333333334 | 0 |
| 0.9590277777777777 | 0 |
| 0.9597222222222223 | 0 |
| 0.9604166666666667 | 0 |
| 0.9611111111111111 | 0 |
| 0.9618055555555555 | 0 |
| 0.9625 | 0 |
| 0.9631944444444445 | 0 |
| 0.9638888888888889 | 0 |
| 0.9645833333333332 | 0 |
| 0.9652777777777778 | 0 |
| 0.9659722222222222 | 0 |
| 0.9666666666666667 | 0 |
| 0.967361111111111 | 0 |
| 0.9680555555555556 | 0 |
| 0.96875 | 0 |
| 0.9694444444444444 | 0 |
| 0.970138888888889 | 0 |
| 0.9708333333333333 | 0 |
| 0.9715277777777778 | 0 |
| 0.9722222222222222 | 0 |
| 0.9729166666666668 | 0 |
| 0.9736111111111111 | 0 |
| 0.9743055555555555 | 0 |
| 0.975 | 0 |
| 0.9756944444444445 | 0 |
| 0.9763888888888889 | 0 |
| 0.9770833333333333 | 0 |
| 0.9777777777777777 | 0 |
| 0.9784722222222223 | 0 |
| 0.9791666666666666 | 0 |
| 0.9798611111111111 | 0 |
| 0.9805555555555556 | 0 |
| 0.9812500000000001 | 0 |
| 0.9819444444444444 | 0 |
| 0.9826388888888888 | 0 |
| 0.9833333333333334 | 0 |
| 0.9840277777777778 | 0 |
| 0.9847222222222222 | 0 |
| 0.9854166666666666 | 0 |
| 0.9861111111111112 | 0 |
| 0.9868055555555556 | 0 |
| 0.9874999999999999 | 0 |
| 0.9881944444444444 | 0 |
| 0.9888888888888889 | 0 |
| 0.9895833333333334 | 0 |
| 0.9902777777777777 | 0 |
| 0.9909722222222223 | 0 |
| 0.9916666666666667 | 0 |
| 0.9923611111111111 | 0 |
| 0.9930555555555555 | 0 |
| 0.99375 | 0 |
| 0.9944444444444445 | 0 |
| 0.9951388888888889 | 0 |
| 0.9958333333333332 | 0 |
| 0.9965277777777778 | 0 |
| 0.9972222222222222 | 0 |
| 0.9979166666666667 | 0 |
| 0.998611111111111 | 0 |
| 0.9993055555555556 | 0 |